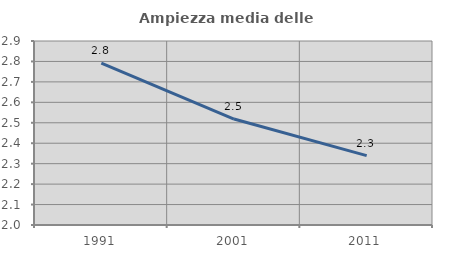
| Category | Ampiezza media delle famiglie |
|---|---|
| 1991.0 | 2.792 |
| 2001.0 | 2.518 |
| 2011.0 | 2.339 |